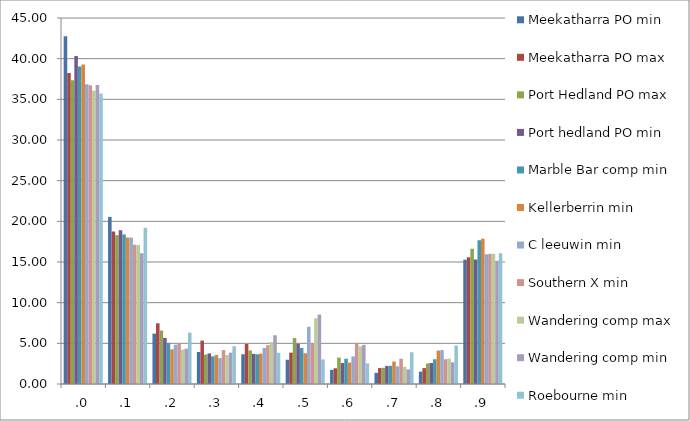
| Category | Meekatharra PO min | Meekatharra PO max | Port Hedland PO max | Port hedland PO min | Marble Bar comp min | Kellerberrin min | C leeuwin min | Southern X min | Wandering comp max | Wandering comp min | Roebourne min |
|---|---|---|---|---|---|---|---|---|---|---|---|
| .0 | 42.765 | 38.251 | 37.346 | 40.332 | 39.035 | 39.27 | 36.849 | 36.747 | 36.043 | 36.769 | 35.712 |
| .1 | 20.547 | 18.757 | 18.298 | 18.904 | 18.39 | 18.026 | 17.998 | 17.132 | 17.093 | 16.074 | 19.216 |
| .2 | 6.194 | 7.458 | 6.57 | 5.671 | 5.053 | 4.261 | 4.822 | 4.949 | 4.219 | 4.349 | 6.323 |
| .3 | 3.939 | 5.339 | 3.621 | 3.762 | 3.399 | 3.567 | 3.184 | 4.175 | 3.561 | 3.855 | 4.645 |
| .4 | 3.658 | 4.917 | 4.123 | 3.701 | 3.649 | 3.735 | 4.431 | 4.777 | 5.137 | 5.993 | 3.833 |
| .5 | 2.98 | 3.852 | 5.652 | 4.94 | 4.422 | 3.779 | 7.031 | 5.015 | 8.084 | 8.542 | 3.02 |
| .6 | 1.741 | 1.932 | 3.243 | 2.578 | 3.11 | 2.626 | 3.398 | 5.049 | 4.631 | 4.811 | 2.543 |
| .7 | 1.367 | 1.955 | 1.992 | 2.224 | 2.232 | 2.763 | 2.176 | 3.11 | 2.113 | 1.795 | 3.903 |
| .8 | 1.519 | 1.955 | 2.525 | 2.578 | 3.041 | 4.111 | 4.171 | 3.047 | 3.117 | 2.67 | 4.733 |
| .9 | 15.288 | 15.584 | 16.631 | 15.311 | 17.67 | 17.862 | 15.94 | 15.999 | 16 | 15.141 | 16.072 |